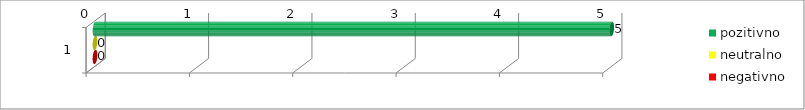
| Category | pozitivno | neutralno | negativno |
|---|---|---|---|
| 0 | 5 | 0 | 0 |